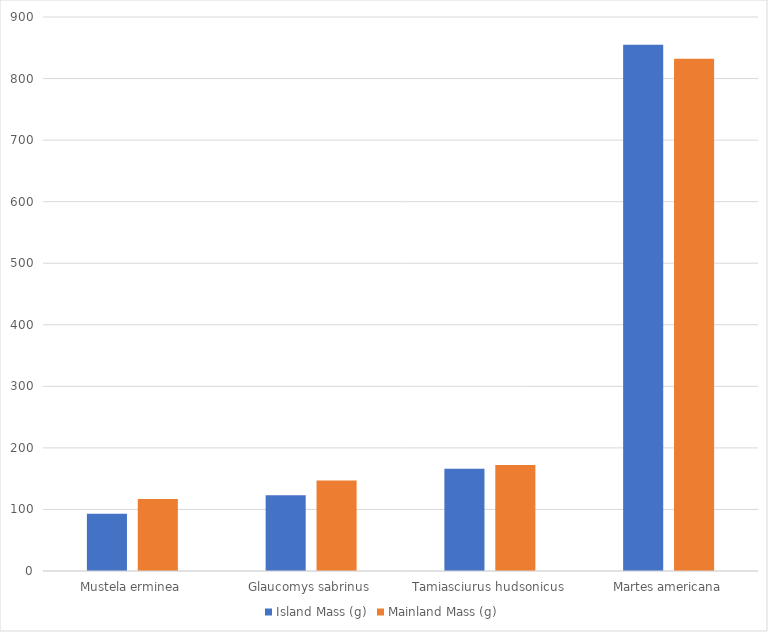
| Category | Island Mass (g) | Mainland Mass (g) |
|---|---|---|
| Mustela erminea | 93 | 117 |
| Glaucomys sabrinus | 123 | 147 |
| Tamiasciurus hudsonicus | 166 | 172 |
| Martes americana | 855 | 832 |